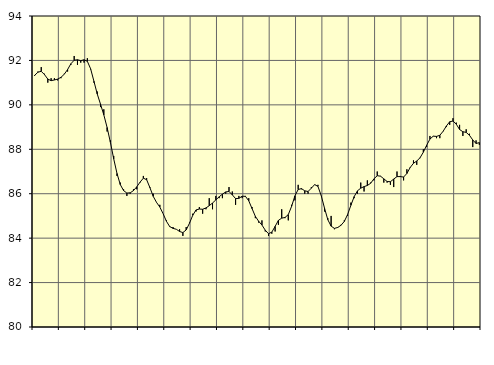
| Category | Piggar | Series 1 |
|---|---|---|
| nan | 91.3 | 91.33 |
| 87.0 | 91.5 | 91.47 |
| 87.0 | 91.7 | 91.51 |
| 87.0 | 91.4 | 91.36 |
| nan | 91 | 91.16 |
| 88.0 | 91.2 | 91.09 |
| 88.0 | 91.2 | 91.12 |
| 88.0 | 91.1 | 91.16 |
| nan | 91.2 | 91.24 |
| 89.0 | 91.4 | 91.38 |
| 89.0 | 91.5 | 91.59 |
| 89.0 | 91.8 | 91.85 |
| nan | 92.2 | 92.01 |
| 90.0 | 91.8 | 92.03 |
| 90.0 | 91.9 | 91.99 |
| 90.0 | 91.9 | 92.03 |
| nan | 92.1 | 91.96 |
| 91.0 | 91.6 | 91.62 |
| 91.0 | 91 | 91.06 |
| 91.0 | 90.6 | 90.49 |
| nan | 89.9 | 90.03 |
| 92.0 | 89.8 | 89.55 |
| 92.0 | 88.8 | 88.98 |
| 92.0 | 88.4 | 88.31 |
| nan | 87.7 | 87.57 |
| 93.0 | 86.8 | 86.91 |
| 93.0 | 86.5 | 86.41 |
| 93.0 | 86.2 | 86.14 |
| nan | 85.9 | 86.03 |
| 94.0 | 86 | 86.04 |
| 94.0 | 86.2 | 86.14 |
| 94.0 | 86.2 | 86.31 |
| nan | 86.5 | 86.52 |
| 95.0 | 86.8 | 86.7 |
| 95.0 | 86.7 | 86.63 |
| 95.0 | 86.3 | 86.27 |
| nan | 86 | 85.88 |
| 96.0 | 85.6 | 85.61 |
| 96.0 | 85.5 | 85.4 |
| 96.0 | 85.1 | 85.1 |
| nan | 84.8 | 84.76 |
| 97.0 | 84.5 | 84.52 |
| 97.0 | 84.5 | 84.44 |
| 97.0 | 84.4 | 84.4 |
| nan | 84.4 | 84.3 |
| 98.0 | 84.1 | 84.25 |
| 98.0 | 84.5 | 84.37 |
| 98.0 | 84.7 | 84.67 |
| nan | 85.1 | 85.03 |
| 99.0 | 85.2 | 85.27 |
| 99.0 | 85.4 | 85.31 |
| 99.0 | 85.1 | 85.3 |
| nan | 85.3 | 85.36 |
| 0.0 | 85.8 | 85.46 |
| 0.0 | 85.3 | 85.58 |
| 0.0 | 85.9 | 85.72 |
| nan | 85.8 | 85.86 |
| 1.0 | 85.8 | 85.98 |
| 1.0 | 86 | 86.08 |
| 1.0 | 86.3 | 86.1 |
| nan | 86.1 | 85.95 |
| 2.0 | 85.5 | 85.78 |
| 2.0 | 85.9 | 85.79 |
| 2.0 | 85.8 | 85.89 |
| nan | 85.9 | 85.88 |
| 3.0 | 85.8 | 85.68 |
| 3.0 | 85.4 | 85.33 |
| 3.0 | 84.9 | 84.98 |
| nan | 84.7 | 84.76 |
| 4.0 | 84.8 | 84.59 |
| 4.0 | 84.3 | 84.36 |
| 4.0 | 84.1 | 84.2 |
| nan | 84.2 | 84.27 |
| 5.0 | 84.3 | 84.53 |
| 5.0 | 84.6 | 84.8 |
| 5.0 | 85.3 | 84.9 |
| nan | 84.9 | 84.93 |
| 6.0 | 84.8 | 85.06 |
| 6.0 | 85.5 | 85.43 |
| 6.0 | 85.7 | 85.9 |
| nan | 86.4 | 86.19 |
| 7.0 | 86.2 | 86.23 |
| 7.0 | 86 | 86.13 |
| 7.0 | 86 | 86.1 |
| nan | 86.3 | 86.25 |
| 8.0 | 86.4 | 86.41 |
| 8.0 | 86.4 | 86.33 |
| 8.0 | 85.9 | 85.91 |
| nan | 85.2 | 85.35 |
| 9.0 | 84.9 | 84.83 |
| 9.0 | 85 | 84.54 |
| 9.0 | 84.4 | 84.44 |
| nan | 84.5 | 84.48 |
| 10.0 | 84.6 | 84.58 |
| 10.0 | 84.8 | 84.75 |
| 10.0 | 85 | 85.06 |
| nan | 85.6 | 85.48 |
| 11.0 | 85.8 | 85.87 |
| 11.0 | 86 | 86.13 |
| 11.0 | 86.5 | 86.25 |
| nan | 86.1 | 86.32 |
| 12.0 | 86.6 | 86.37 |
| 12.0 | 86.5 | 86.47 |
| 12.0 | 86.6 | 86.67 |
| nan | 87 | 86.81 |
| 13.0 | 86.8 | 86.79 |
| 13.0 | 86.5 | 86.67 |
| 13.0 | 86.5 | 86.55 |
| nan | 86.4 | 86.54 |
| 14.0 | 86.3 | 86.66 |
| 14.0 | 87 | 86.77 |
| 14.0 | 86.8 | 86.77 |
| nan | 86.6 | 86.75 |
| 15.0 | 87.1 | 86.91 |
| 15.0 | 87.2 | 87.18 |
| 15.0 | 87.5 | 87.37 |
| nan | 87.3 | 87.47 |
| 16.0 | 87.6 | 87.62 |
| 16.0 | 88 | 87.87 |
| 16.0 | 88.1 | 88.18 |
| nan | 88.6 | 88.46 |
| 17.0 | 88.6 | 88.59 |
| 17.0 | 88.5 | 88.58 |
| 17.0 | 88.5 | 88.63 |
| nan | 88.8 | 88.81 |
| 18.0 | 89 | 89.05 |
| 18.0 | 89.1 | 89.24 |
| 18.0 | 89.4 | 89.27 |
| nan | 89.2 | 89.13 |
| 19.0 | 89.1 | 88.89 |
| 19.0 | 88.6 | 88.79 |
| 19.0 | 88.9 | 88.76 |
| nan | 88.7 | 88.63 |
| 20.0 | 88.1 | 88.42 |
| 20.0 | 88.4 | 88.26 |
| 20.0 | 88.2 | 88.3 |